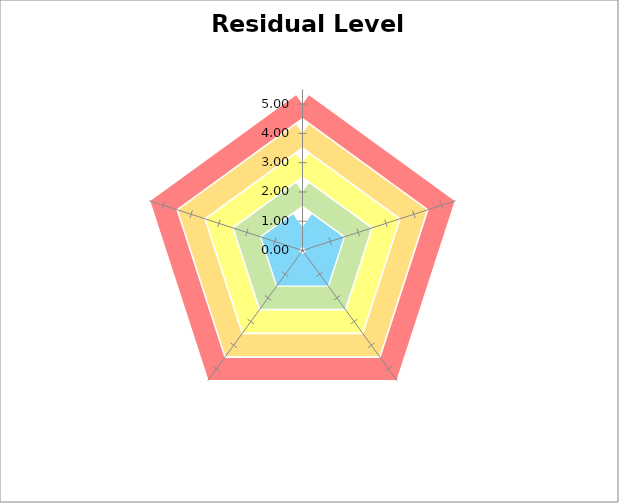
| Category | B | G | Y | O | R |
|---|---|---|---|---|---|
| Strategic | 0.8 | 2 | 3 | 4 | 5 |
| Management | 0.8 | 2 | 3 | 4 | 5 |
| Operations | 0.8 | 2 | 3 | 4 | 5 |
| ICT | 0.8 | 2 | 3 | 4 | 5 |
| External sources | 0.8 | 2 | 3 | 4 | 5 |